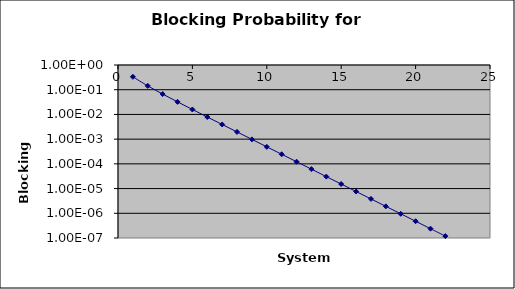
| Category | Series 0 |
|---|---|
| 1.0 | 0.333 |
| 2.0 | 0.143 |
| 3.0 | 0.067 |
| 4.0 | 0.032 |
| 5.0 | 0.016 |
| 6.0 | 0.008 |
| 7.0 | 0.004 |
| 8.0 | 0.002 |
| 9.0 | 0.001 |
| 10.0 | 0 |
| 11.0 | 0 |
| 12.0 | 0 |
| 13.0 | 0 |
| 14.0 | 0 |
| 15.0 | 0 |
| 16.0 | 0 |
| 17.0 | 0 |
| 18.0 | 0 |
| 19.0 | 0 |
| 20.0 | 0 |
| 21.0 | 0 |
| 22.0 | 0 |